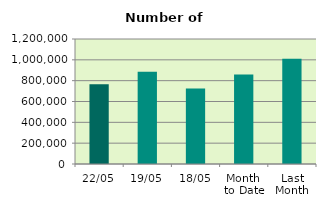
| Category | Series 0 |
|---|---|
| 22/05 | 766328 |
| 19/05 | 885084 |
| 18/05 | 724054 |
| Month 
to Date | 858716.533 |
| Last
Month | 1010681.333 |